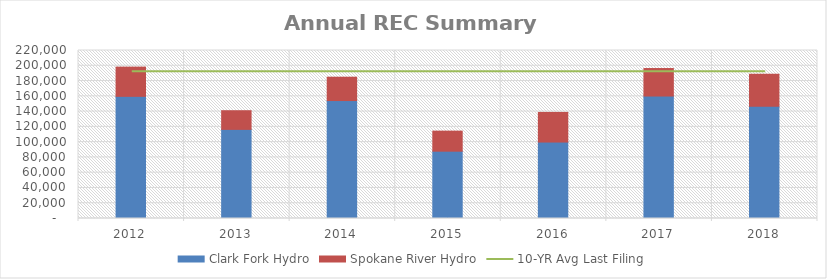
| Category | Clark Fork Hydro | Spokane River Hydro |
|---|---|---|
| 2012.0 | 159964.768 | 38280.191 |
| 2013.0 | 116707.398 | 24442.978 |
| 2014.0 | 154459.506 | 30580.779 |
| 2015.0 | 88159.198 | 26249.751 |
| 2016.0 | 100115.436 | 38800.067 |
| 2017.0 | 160361.299 | 36026.612 |
| 2018.0 | 146880.057 | 42035.774 |